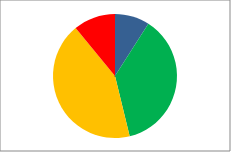
| Category | Series 0 | Series 1 |
|---|---|---|
| Outstanding | 19 | 0.09 |
| Good | 78 | 0.371 |
| RI | 90 | 0.429 |
| Inadequate | 23 | 0.11 |